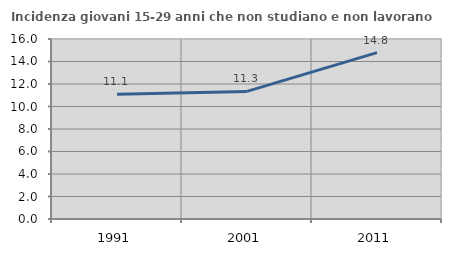
| Category | Incidenza giovani 15-29 anni che non studiano e non lavorano  |
|---|---|
| 1991.0 | 11.091 |
| 2001.0 | 11.342 |
| 2011.0 | 14.791 |